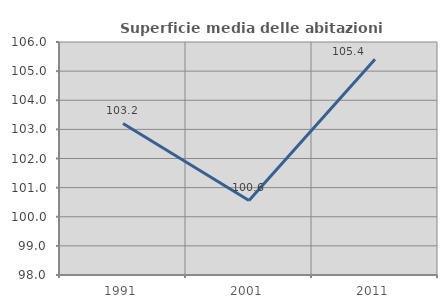
| Category | Superficie media delle abitazioni occupate |
|---|---|
| 1991.0 | 103.202 |
| 2001.0 | 100.56 |
| 2011.0 | 105.41 |